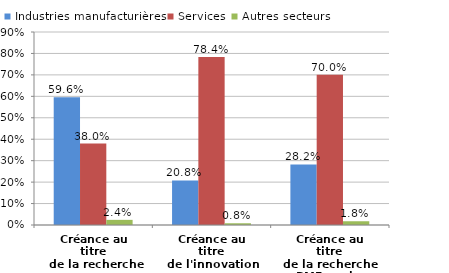
| Category | Industries manufacturières | Services | Autres secteurs |
|---|---|---|---|
| Créance au titre
 de la recherche | 0.596 | 0.38 | 0.024 |
| Créance au titre
de l'innovation | 0.208 | 0.784 | 0.008 |
| Créance au titre
de la recherche
PME seules | 0.282 | 0.7 | 0.018 |